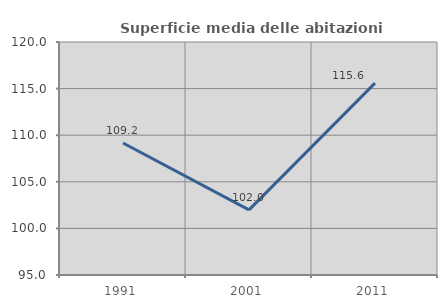
| Category | Superficie media delle abitazioni occupate |
|---|---|
| 1991.0 | 109.164 |
| 2001.0 | 101.99 |
| 2011.0 | 115.581 |